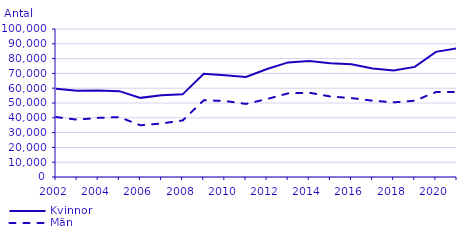
| Category | Kvinnor | Män |
|---|---|---|
| 2002.0 | 59598 | 40532 |
| 2003.0 | 58330 | 38727 |
| 2004.0 | 58434 | 39957 |
| 2005.0 | 58019 | 40481 |
| 2006.0 | 53471 | 34944 |
| 2007.0 | 55277 | 36155 |
| 2008.0 | 55847 | 38199 |
| 2009.0 | 69814 | 51848 |
| 2010.0 | 68674 | 51375 |
| 2011.0 | 67596 | 49376 |
| 2012.0 | 72998 | 52689 |
| 2013.0 | 77428 | 56510 |
| 2014.0 | 78294 | 56964 |
| 2015.0 | 76874 | 54394 |
| 2016.0 | 76183 | 53326 |
| 2017.0 | 73362 | 51564 |
| 2018.0 | 71948 | 50424 |
| 2019.0 | 74383 | 51558 |
| 2020.0 | 84567 | 57357 |
| 2021.0 | 86992 | 57509 |